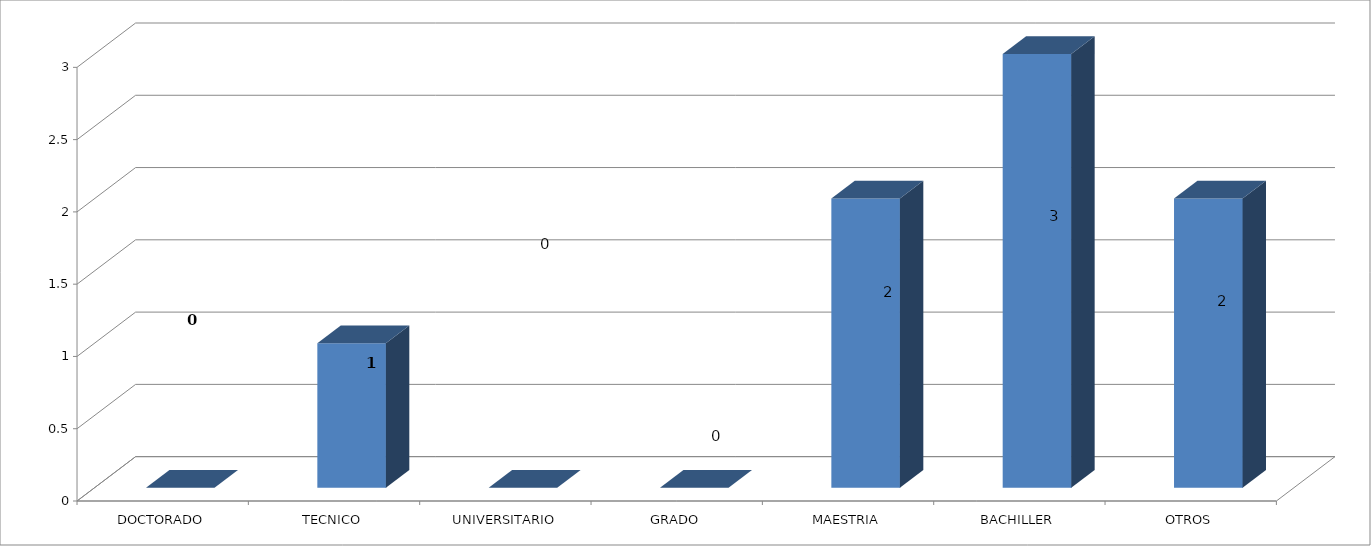
| Category | Series 0 |
|---|---|
| DOCTORADO | 0 |
| TECNICO | 1 |
| UNIVERSITARIO | 0 |
| GRADO | 0 |
| MAESTRIA | 2 |
| BACHILLER | 3 |
| OTROS | 2 |